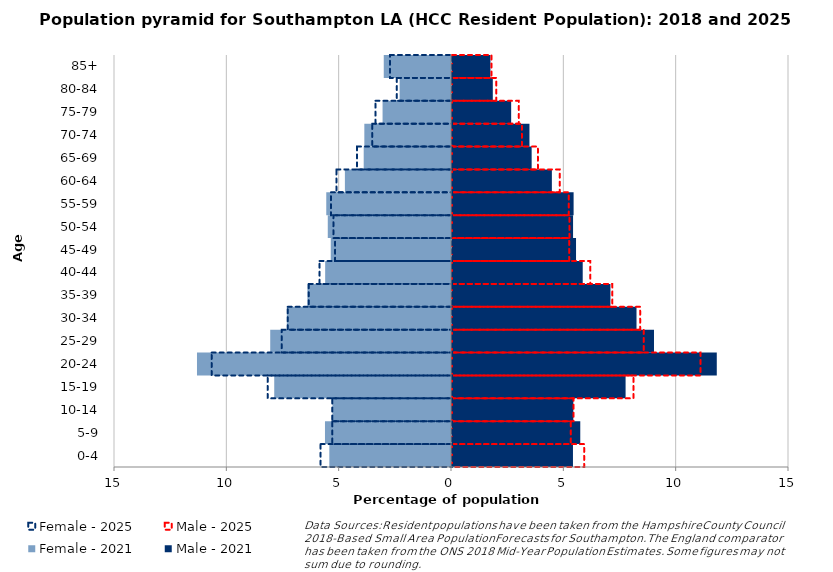
| Category | Male - 2021 | Female - 2021 | Male - 2025 | Female - 2025 |
|---|---|---|---|---|
| 0-4 | 5.384 | -5.416 | 5.884 | -5.849 |
| 5-9 | 5.709 | -5.609 | 5.289 | -5.328 |
| 10-14 | 5.4 | -5.272 | 5.412 | -5.329 |
| 15-19 | 7.727 | -7.868 | 8.077 | -8.206 |
| 20-24 | 11.786 | -11.306 | 11.063 | -10.698 |
| 25-29 | 8.991 | -8.046 | 8.533 | -7.583 |
| 30-34 | 8.213 | -7.308 | 8.374 | -7.313 |
| 35-39 | 7.052 | -6.392 | 7.138 | -6.378 |
| 40-44 | 5.818 | -5.601 | 6.157 | -5.896 |
| 45-49 | 5.521 | -5.353 | 5.215 | -5.204 |
| 50-54 | 5.389 | -5.485 | 5.227 | -5.28 |
| 55-59 | 5.413 | -5.552 | 5.199 | -5.387 |
| 60-64 | 4.445 | -4.723 | 4.797 | -5.146 |
| 65-69 | 3.545 | -3.886 | 3.823 | -4.229 |
| 70-74 | 3.448 | -3.858 | 3.111 | -3.551 |
| 75-79 | 2.634 | -3.046 | 2.975 | -3.407 |
| 80-84 | 1.816 | -2.286 | 1.972 | -2.455 |
| 85+ | 1.711 | -2.993 | 1.756 | -2.761 |